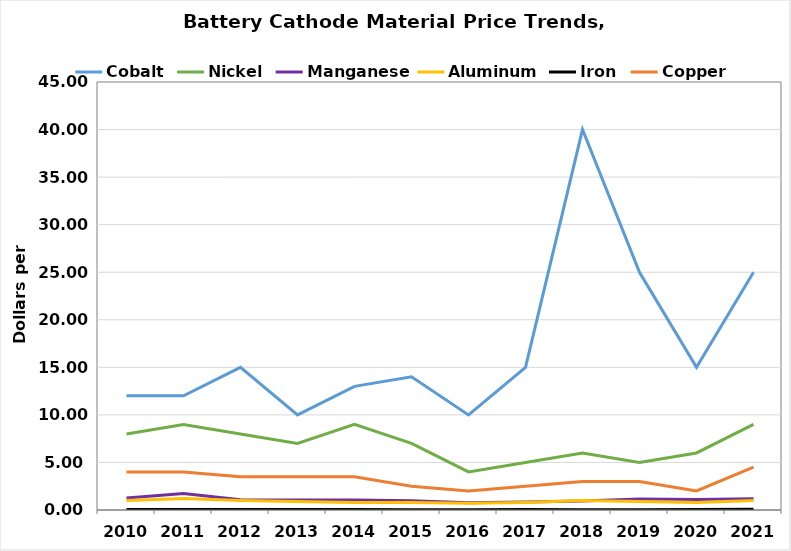
| Category | Cobalt | Nickel | Manganese | Aluminum | Iron | Copper |
|---|---|---|---|---|---|---|
| 2010.0 | 12 | 8 | 1.252 | 1 | 0.05 | 4 |
| 2011.0 | 12 | 9 | 1.742 | 1.2 | 0.05 | 4 |
| 2012.0 | 15 | 8 | 1.066 | 1 | 0.05 | 3.5 |
| 2013.0 | 10 | 7 | 1.057 | 0.9 | 0.05 | 3.5 |
| 2014.0 | 13 | 9 | 1.039 | 0.8 | 0.04 | 3.5 |
| 2015.0 | 14 | 7 | 0.97 | 0.8 | 0.03 | 2.5 |
| 2016.0 | 10 | 4 | 0.753 | 0.7 | 0.02 | 2 |
| 2017.0 | 15 | 5 | 0.83 | 0.8 | 0.04 | 2.5 |
| 2018.0 | 40 | 6 | 0.934 | 1 | 0.03 | 3 |
| 2019.0 | 25 | 5 | 1.15 | 0.9 | 0.03 | 3 |
| 2020.0 | 15 | 6 | 1.11 | 0.8 | 0.06 | 2 |
| 2021.0 | 25 | 9 | 1.19 | 1 | 0.08 | 4.5 |